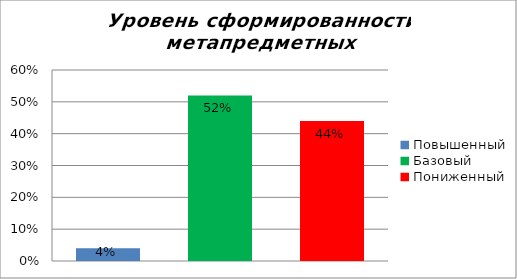
| Category | Уровень сформированности метапредметных результатов |
|---|---|
| Повышенный | 0.04 |
| Базовый | 0.52 |
| Пониженный | 0.44 |